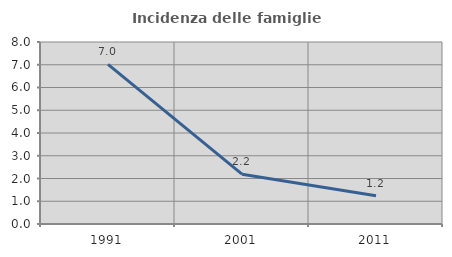
| Category | Incidenza delle famiglie numerose |
|---|---|
| 1991.0 | 7.013 |
| 2001.0 | 2.19 |
| 2011.0 | 1.242 |